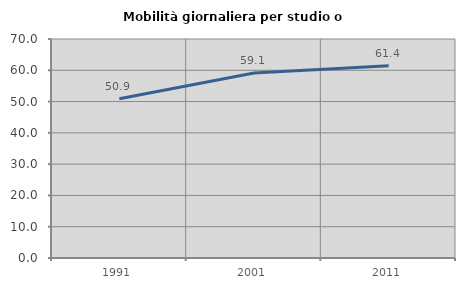
| Category | Mobilità giornaliera per studio o lavoro |
|---|---|
| 1991.0 | 50.897 |
| 2001.0 | 59.14 |
| 2011.0 | 61.424 |